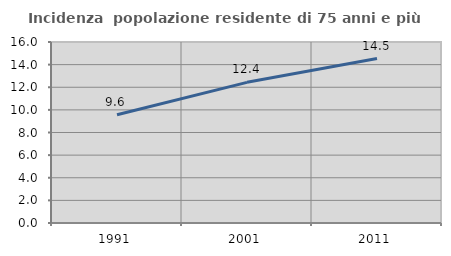
| Category | Incidenza  popolazione residente di 75 anni e più |
|---|---|
| 1991.0 | 9.562 |
| 2001.0 | 12.434 |
| 2011.0 | 14.54 |